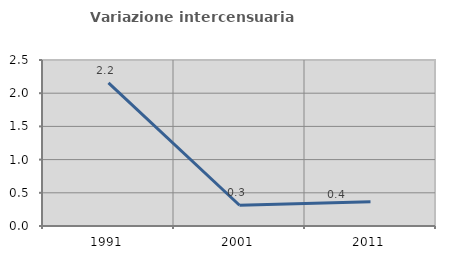
| Category | Variazione intercensuaria annua |
|---|---|
| 1991.0 | 2.155 |
| 2001.0 | 0.313 |
| 2011.0 | 0.365 |